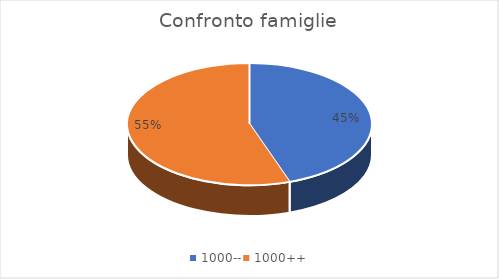
| Category | Series 0 |
|---|---|
| 1000-- | 135 |
| 1000++ | 167 |